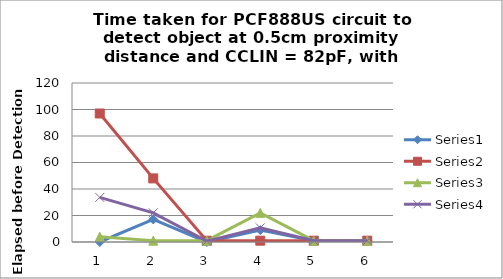
| Category | Series 0 | Series 1 | Series 2 | Series 3 |
|---|---|---|---|---|
| 0 | 0 | 97 | 4 | 33.667 |
| 1 | 17 | 48 | 1 | 22 |
| 2 | 0 | 1 | 1 | 0.667 |
| 3 | 9 | 1 | 22 | 10.667 |
| 4 | 1 | 1 | 1 | 1 |
| 5 | 1 | 1 | 1 | 1 |